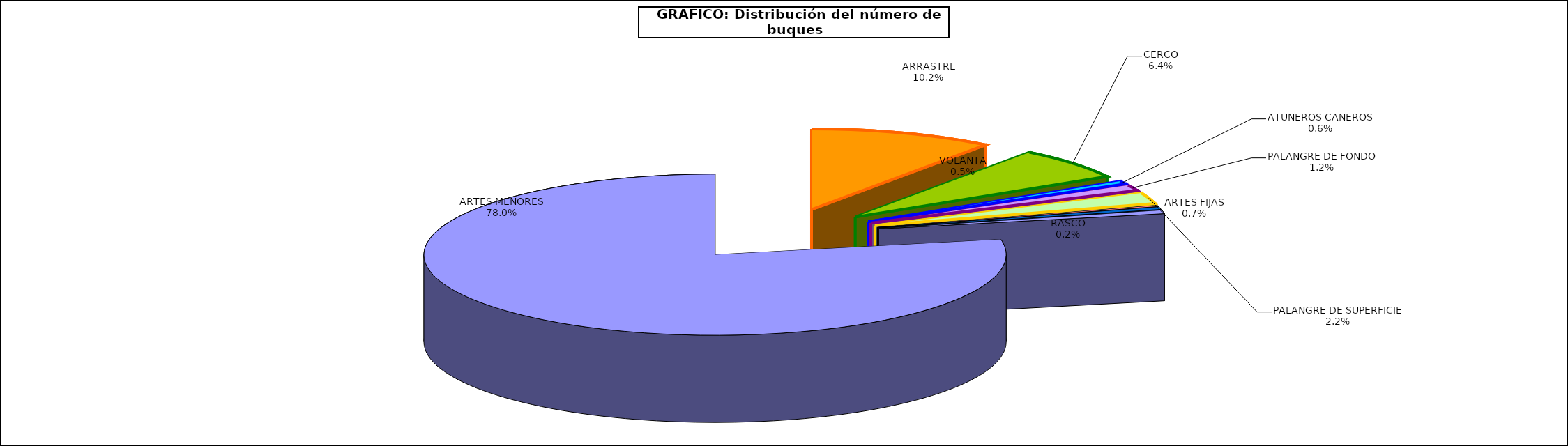
| Category | Series 0 |
|---|---|
| ARRASTRE | 891 |
| CERCO | 561 |
| ATUNEROS CAÑEROS | 53 |
| PALANGRE DE FONDO | 101 |
| PALANGRE DE SUPERFICIE | 191 |
| RASCO | 21 |
| VOLANTA | 41 |
| ARTES FIJAS | 59 |
| ARTES MENORES | 6814 |